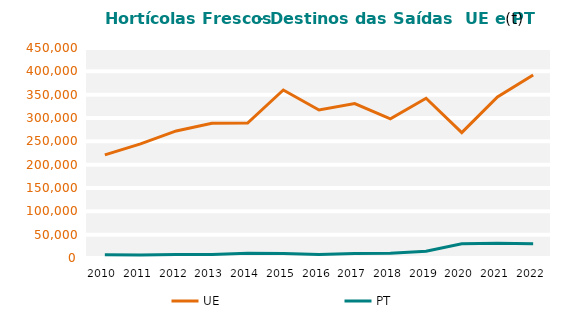
| Category | UE | PT |
|---|---|---|
| 2010.0 | 220907.295 | 6822.237 |
| 2011.0 | 244646.041 | 6609.02 |
| 2012.0 | 272290.759 | 7303.768 |
| 2013.0 | 288669.712 | 7747.563 |
| 2014.0 | 289251.889 | 10352.772 |
| 2015.0 | 359964.187 | 9837.726 |
| 2016.0 | 317113.684 | 7506.759 |
| 2017.0 | 330942.488 | 9879.529 |
| 2018.0 | 298351.133 | 10138.958 |
| 2019.0 | 342252.993 | 14460.334 |
| 2020.0 | 268547.432 | 30318.651 |
| 2021.0 | 345332.495 | 31392.404 |
| 2022.0 | 391947.736 | 30709.585 |